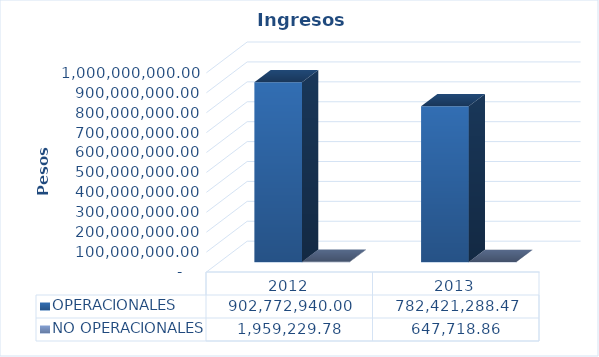
| Category | OPERACIONALES | NO OPERACIONALES |
|---|---|---|
| 2012.0 | 902772940 | 1959229.78 |
| 2013.0 | 782421288.47 | 647718.86 |